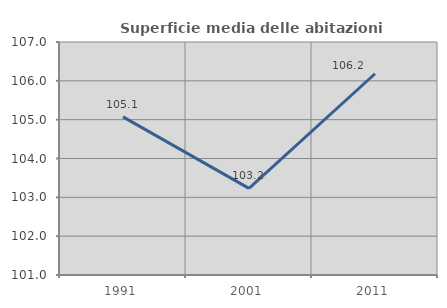
| Category | Superficie media delle abitazioni occupate |
|---|---|
| 1991.0 | 105.073 |
| 2001.0 | 103.23 |
| 2011.0 | 106.182 |